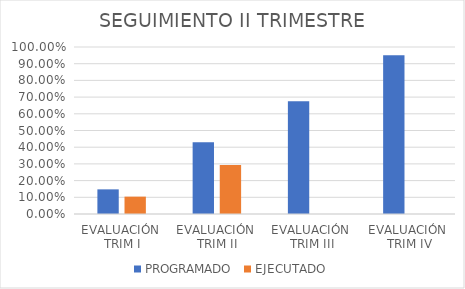
| Category | PROGRAMADO | EJECUTADO |
|---|---|---|
| EVALUACIÓN 
TRIM I | 0.148 | 0.104 |
| EVALUACIÓN 
TRIM II | 0.43 | 0.294 |
| EVALUACIÓN 
TRIM III | 0.675 | 0 |
| EVALUACIÓN
 TRIM IV | 0.95 | 0 |